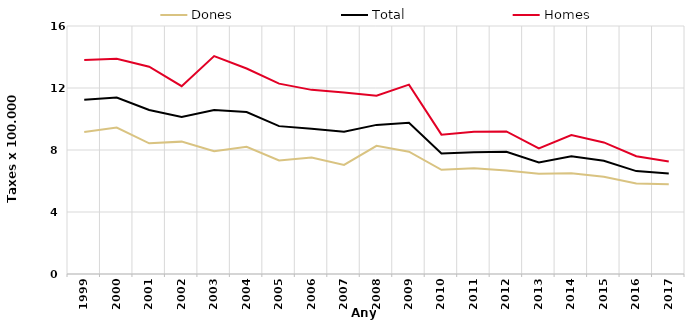
| Category | Dones | Total | Homes |
|---|---|---|---|
| 1999.0 | 9.16 | 11.24 | 13.8 |
| 2000.0 | 9.45 | 11.39 | 13.89 |
| 2001.0 | 8.43 | 10.58 | 13.37 |
| 2002.0 | 8.54 | 10.13 | 12.12 |
| 2003.0 | 7.92 | 10.58 | 14.06 |
| 2004.0 | 8.21 | 10.45 | 13.26 |
| 2005.0 | 7.33 | 9.54 | 12.28 |
| 2006.0 | 7.51 | 9.37 | 11.88 |
| 2007.0 | 7.04 | 9.18 | 11.71 |
| 2008.0 | 8.27 | 9.62 | 11.5 |
| 2009.0 | 7.89 | 9.75 | 12.22 |
| 2010.0 | 6.72 | 7.78 | 8.99 |
| 2011.0 | 6.83 | 7.86 | 9.17 |
| 2012.0 | 6.68 | 7.88 | 9.2 |
| 2013.0 | 6.47 | 7.2 | 8.1 |
| 2014.0 | 6.5 | 7.6 | 8.96 |
| 2015.0 | 6.27 | 7.3 | 8.49 |
| 2016.0 | 5.84 | 6.64 | 7.6 |
| 2017.0 | 5.79 | 6.49 | 7.26 |